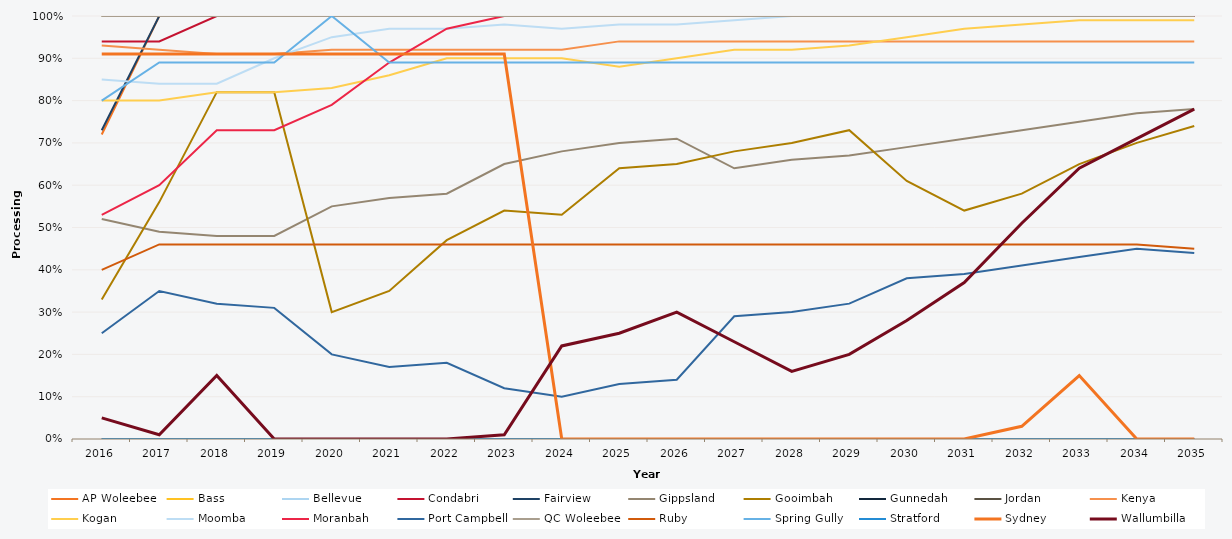
| Category | AP Woleebee | Bass | Bellevue | Condabri | Fairview | Gippsland | Gooimbah | Gunnedah | Jordan | Kenya | Kogan | Moomba | Moranbah | Port Campbell | QC Woleebee | Ruby | Spring Gully | Stratford | Sydney | Wallumbilla |
|---|---|---|---|---|---|---|---|---|---|---|---|---|---|---|---|---|---|---|---|---|
| 2016.0 | 0.72 | 1 | 1 | 0.94 | 0.73 | 0.52 | 0.33 | 0 | 1 | 0.93 | 0.8 | 0.85 | 0.53 | 0.25 | 1 | 0.4 | 0.8 | 0 | 0.91 | 0.05 |
| 2017.0 | 1 | 1 | 1 | 0.94 | 1 | 0.49 | 0.56 | 0 | 1 | 0.92 | 0.8 | 0.84 | 0.6 | 0.35 | 1 | 0.46 | 0.89 | 0 | 0.91 | 0.01 |
| 2018.0 | 1 | 1 | 1 | 1 | 1 | 0.48 | 0.82 | 0 | 1 | 0.91 | 0.82 | 0.84 | 0.73 | 0.32 | 1 | 0.46 | 0.89 | 0 | 0.91 | 0.15 |
| 2019.0 | 1 | 1 | 1 | 1 | 1 | 0.48 | 0.82 | 0 | 1 | 0.91 | 0.82 | 0.9 | 0.73 | 0.31 | 1 | 0.46 | 0.89 | 0 | 0.91 | 0 |
| 2020.0 | 1 | 1 | 1 | 1 | 1 | 0.55 | 0.3 | 0 | 1 | 0.92 | 0.83 | 0.95 | 0.79 | 0.2 | 1 | 0.46 | 1 | 0 | 0.91 | 0 |
| 2021.0 | 1 | 1 | 1 | 1 | 1 | 0.57 | 0.35 | 0 | 1 | 0.92 | 0.86 | 0.97 | 0.89 | 0.17 | 1 | 0.46 | 0.89 | 0 | 0.91 | 0 |
| 2022.0 | 1 | 1 | 1 | 1 | 1 | 0.58 | 0.47 | 0 | 1 | 0.92 | 0.9 | 0.97 | 0.97 | 0.18 | 1 | 0.46 | 0.89 | 0 | 0.91 | 0 |
| 2023.0 | 1 | 1 | 1 | 1 | 1 | 0.65 | 0.54 | 0 | 1 | 0.92 | 0.9 | 0.98 | 1 | 0.12 | 1 | 0.46 | 0.89 | 0 | 0.91 | 0.01 |
| 2024.0 | 1 | 1 | 1 | 1 | 1 | 0.68 | 0.53 | 0 | 1 | 0.92 | 0.9 | 0.97 | 1 | 0.1 | 1 | 0.46 | 0.89 | 0 | 0 | 0.22 |
| 2025.0 | 1 | 1 | 1 | 1 | 1 | 0.7 | 0.64 | 0 | 1 | 0.94 | 0.88 | 0.98 | 1 | 0.13 | 1 | 0.46 | 0.89 | 0 | 0 | 0.25 |
| 2026.0 | 1 | 1 | 1 | 1 | 1 | 0.71 | 0.65 | 0 | 1 | 0.94 | 0.9 | 0.98 | 1 | 0.14 | 1 | 0.46 | 0.89 | 0 | 0 | 0.3 |
| 2027.0 | 1 | 1 | 1 | 1 | 1 | 0.64 | 0.68 | 0 | 1 | 0.94 | 0.92 | 0.99 | 1 | 0.29 | 1 | 0.46 | 0.89 | 0 | 0 | 0.23 |
| 2028.0 | 1 | 1 | 1 | 1 | 1 | 0.66 | 0.7 | 0 | 1 | 0.94 | 0.92 | 1 | 1 | 0.3 | 1 | 0.46 | 0.89 | 0 | 0 | 0.16 |
| 2029.0 | 1 | 1 | 1 | 1 | 1 | 0.67 | 0.73 | 0 | 1 | 0.94 | 0.93 | 1 | 1 | 0.32 | 1 | 0.46 | 0.89 | 0 | 0 | 0.2 |
| 2030.0 | 1 | 1 | 1 | 1 | 1 | 0.69 | 0.61 | 0 | 1 | 0.94 | 0.95 | 1 | 1 | 0.38 | 1 | 0.46 | 0.89 | 0 | 0 | 0.28 |
| 2031.0 | 1 | 1 | 1 | 1 | 1 | 0.71 | 0.54 | 0 | 1 | 0.94 | 0.97 | 1 | 1 | 0.39 | 1 | 0.46 | 0.89 | 0 | 0 | 0.37 |
| 2032.0 | 1 | 1 | 1 | 1 | 1 | 0.73 | 0.58 | 0 | 1 | 0.94 | 0.98 | 1 | 1 | 0.41 | 1 | 0.46 | 0.89 | 0 | 0.03 | 0.51 |
| 2033.0 | 1 | 1 | 1 | 1 | 1 | 0.75 | 0.65 | 0 | 1 | 0.94 | 0.99 | 1 | 1 | 0.43 | 1 | 0.46 | 0.89 | 0 | 0.15 | 0.64 |
| 2034.0 | 1 | 1 | 1 | 1 | 1 | 0.77 | 0.7 | 0 | 1 | 0.94 | 0.99 | 1 | 1 | 0.45 | 1 | 0.46 | 0.89 | 0 | 0 | 0.71 |
| 2035.0 | 1 | 1 | 1 | 1 | 1 | 0.78 | 0.74 | 0 | 1 | 0.94 | 0.99 | 1 | 1 | 0.44 | 1 | 0.45 | 0.89 | 0 | 0 | 0.78 |